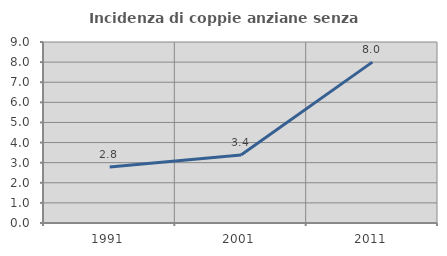
| Category | Incidenza di coppie anziane senza figli  |
|---|---|
| 1991.0 | 2.785 |
| 2001.0 | 3.382 |
| 2011.0 | 8 |